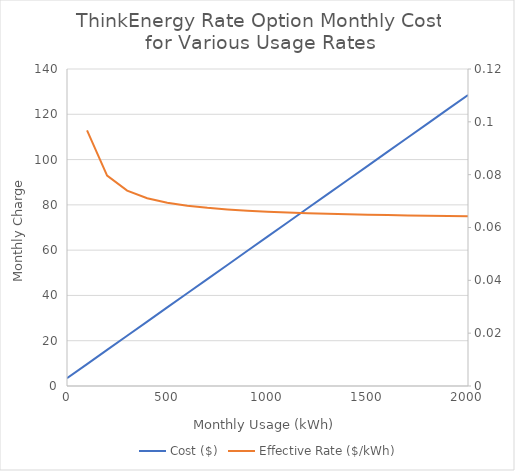
| Category | Cost ($) |
|---|---|
| 0.0 | 3.42 |
| 100.0 | 9.675 |
| 200.0 | 15.93 |
| 300.0 | 22.185 |
| 400.0 | 28.44 |
| 500.0 | 34.695 |
| 600.0 | 40.95 |
| 700.0 | 47.205 |
| 800.0 | 53.46 |
| 900.0 | 59.715 |
| 1000.0 | 65.97 |
| 1100.0 | 72.225 |
| 1200.0 | 78.48 |
| 1300.0 | 84.735 |
| 1400.0 | 90.99 |
| 1500.0 | 97.245 |
| 1600.0 | 103.5 |
| 1700.0 | 109.755 |
| 1800.0 | 116.01 |
| 1900.0 | 122.265 |
| 2000.0 | 128.52 |